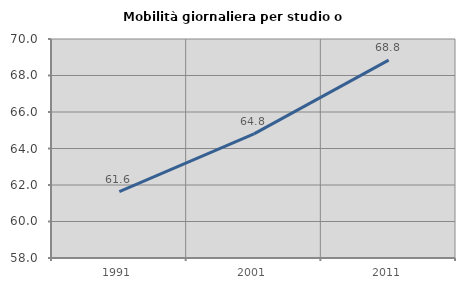
| Category | Mobilità giornaliera per studio o lavoro |
|---|---|
| 1991.0 | 61.633 |
| 2001.0 | 64.799 |
| 2011.0 | 68.839 |